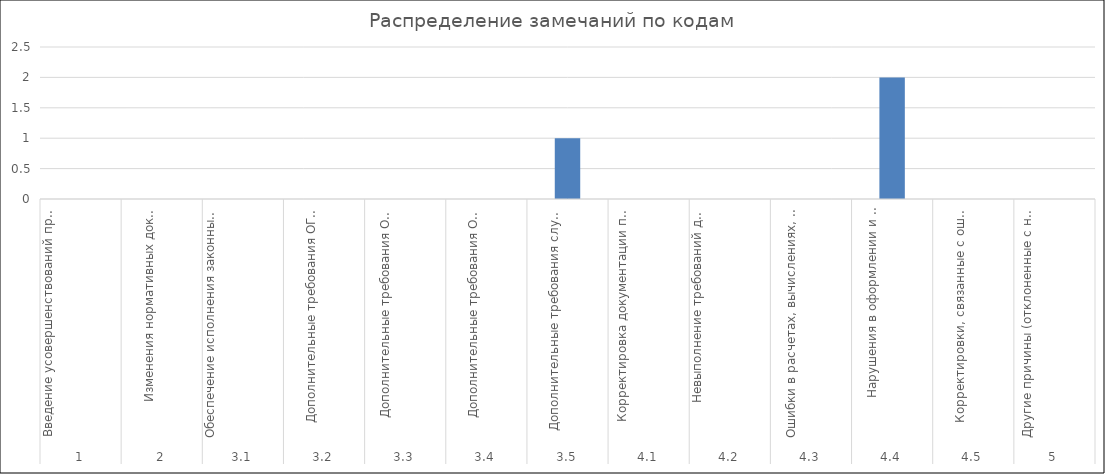
| Category | Series 0 |
|---|---|
| 0 | 0 |
| 1 | 0 |
| 2 | 0 |
| 3 | 0 |
| 4 | 0 |
| 5 | 0 |
| 6 | 1 |
| 7 | 0 |
| 8 | 0 |
| 9 | 0 |
| 10 | 2 |
| 11 | 0 |
| 12 | 0 |